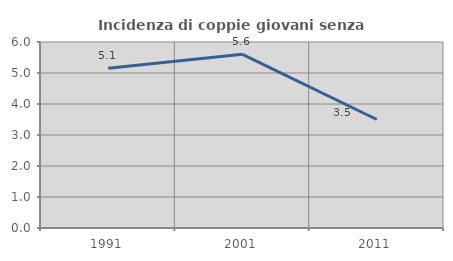
| Category | Incidenza di coppie giovani senza figli |
|---|---|
| 1991.0 | 5.15 |
| 2001.0 | 5.601 |
| 2011.0 | 3.5 |